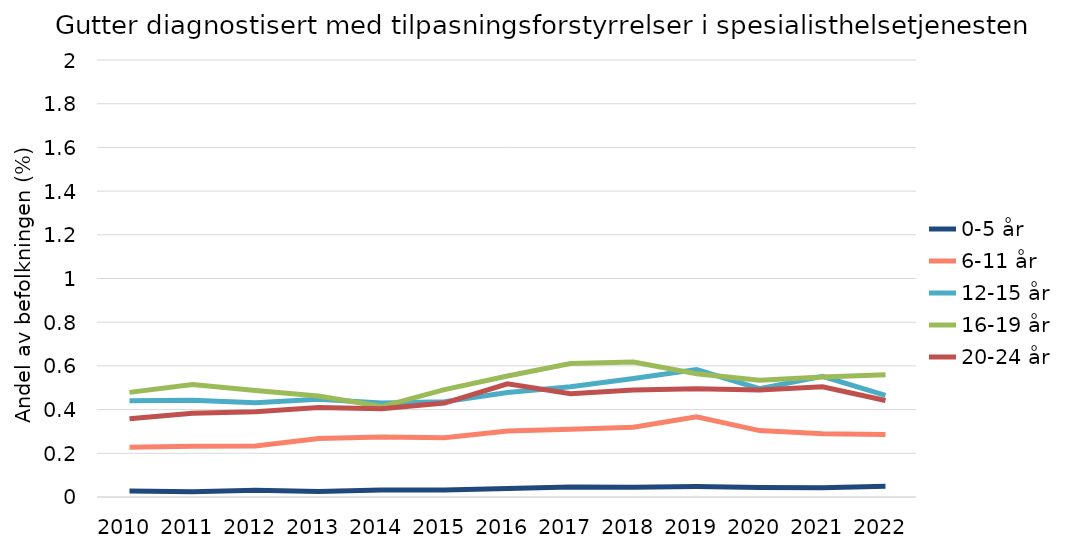
| Category | 0-5 år | 6-11 år | 12-15 år | 16-19 år | 20-24 år |
|---|---|---|---|---|---|
| 2010.0 | 0.027 | 0.227 | 0.44 | 0.479 | 0.358 |
| 2011.0 | 0.024 | 0.232 | 0.443 | 0.514 | 0.383 |
| 2012.0 | 0.031 | 0.234 | 0.432 | 0.487 | 0.39 |
| 2013.0 | 0.025 | 0.267 | 0.447 | 0.463 | 0.41 |
| 2014.0 | 0.032 | 0.274 | 0.43 | 0.414 | 0.404 |
| 2015.0 | 0.032 | 0.271 | 0.436 | 0.491 | 0.43 |
| 2016.0 | 0.039 | 0.302 | 0.478 | 0.554 | 0.518 |
| 2017.0 | 0.046 | 0.31 | 0.505 | 0.61 | 0.473 |
| 2018.0 | 0.045 | 0.319 | 0.542 | 0.618 | 0.489 |
| 2019.0 | 0.048 | 0.368 | 0.584 | 0.564 | 0.496 |
| 2020.0 | 0.044 | 0.304 | 0.496 | 0.534 | 0.49 |
| 2021.0 | 0.042 | 0.289 | 0.552 | 0.55 | 0.505 |
| 2022.0 | 0.049 | 0.286 | 0.465 | 0.56 | 0.442 |